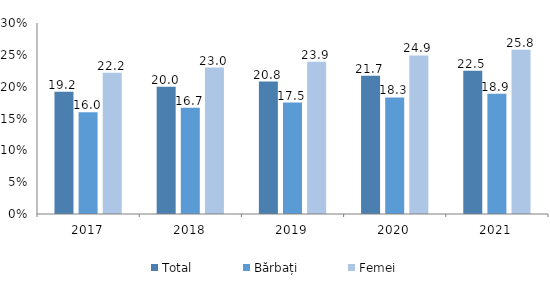
| Category | Total | Bărbați | Femei |
|---|---|---|---|
| 2017.0 | 19.2 | 16 | 22.2 |
| 2018.0 | 20 | 16.7 | 23 |
| 2019.0 | 20.8 | 17.5 | 23.9 |
| 2020.0 | 21.7 | 18.3 | 24.9 |
| 2021.0 | 22.5 | 18.9 | 25.8 |